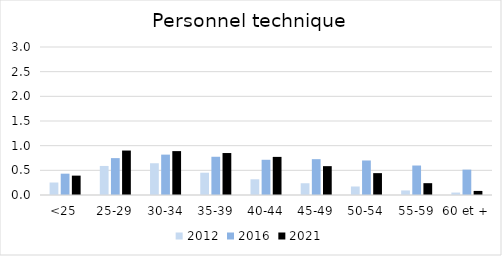
| Category | 2012 | 2016 | 2021 |
|---|---|---|---|
| <25 | 0.253 | 0.432 | 0.393 |
| 25-29 | 0.589 | 0.748 | 0.901 |
| 30-34 | 0.644 | 0.819 | 0.89 |
| 35-39 | 0.452 | 0.775 | 0.851 |
| 40-44 | 0.318 | 0.714 | 0.772 |
| 45-49 | 0.238 | 0.726 | 0.585 |
| 50-54 | 0.173 | 0.7 | 0.443 |
| 55-59 | 0.092 | 0.598 | 0.24 |
| 60 et + | 0.049 | 0.514 | 0.083 |